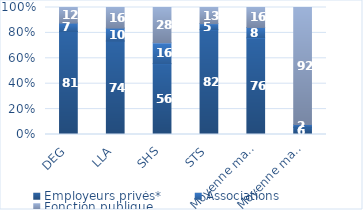
| Category | Employeurs privés* | Associations | Fonction publique |
|---|---|---|---|
| DEG | 81.09 | 6.61 | 12.3 |
| LLA | 73.55 | 10.23 | 16.21 |
| SHS | 55.79 | 16.34 | 27.87 |
| STS | 82 | 4.81 | 12.61 |
| Moyenne master LMD | 76.01 | 8.29 | 15.7 |
| Moyenne master Ens. | 5.74 | 2.06 | 92.2 |